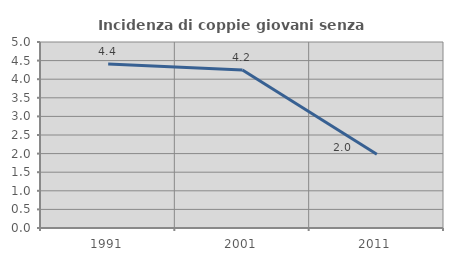
| Category | Incidenza di coppie giovani senza figli |
|---|---|
| 1991.0 | 4.412 |
| 2001.0 | 4.245 |
| 2011.0 | 1.98 |